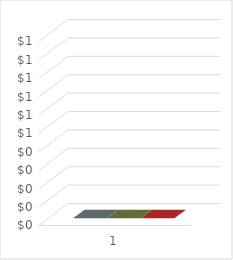
| Category | Series 0 | Series 2 | Series 1 |
|---|---|---|---|
| 0 | 0 | 0 | 0 |